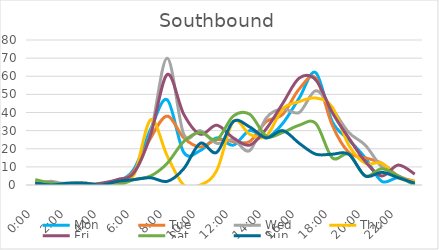
| Category | Mon | Tue | Wed | Thu | Fri | Sat | Sun |
|---|---|---|---|---|---|---|---|
| 0.0 | 0 | 1 | 1 | 2 | 1 | 3 | 1 |
| 0.041667 | 1 | 0 | 2 | 0 | 1 | 1 | 0 |
| 0.083333 | 0 | 0 | 0 | 0 | 0 | 1 | 1 |
| 0.125 | 0 | 1 | 0 | 0 | 0 | 1 | 1 |
| 0.166667 | 0 | 0 | 0 | 0 | 1 | 0 | 0 |
| 0.208333 | 2 | 1 | 3 | 2 | 3 | 0 | 2 |
| 0.25 | 9 | 8 | 7 | 6 | 7 | 3 | 3 |
| 0.291667 | 31 | 26 | 29 | 36 | 28 | 5 | 4 |
| 0.333333 | 47 | 38 | 70 | 16 | 61 | 12 | 2 |
| 0.375 | 18 | 26 | 28 | 0 | 39 | 24 | 9 |
| 0.416667 | 19 | 21 | 30 | 0 | 28 | 29 | 23 |
| 0.458333 | 26 | 25 | 23 | 8 | 33 | 25 | 18 |
| 0.5 | 22 | 24 | 25 | 35 | 26 | 38 | 35 |
| 0.541667 | 30 | 24 | 19 | 28 | 22 | 39 | 32 |
| 0.5833333333333334 | 26 | 35 | 37 | 27 | 31 | 27 | 26 |
| 0.625 | 34 | 39 | 42 | 42 | 45 | 29 | 30 |
| 0.666667 | 48 | 53 | 40 | 46 | 59 | 33 | 23 |
| 0.708333 | 62 | 59 | 52 | 48 | 58 | 34 | 17 |
| 0.75 | 35 | 33 | 42 | 43 | 40 | 15 | 17 |
| 0.791667 | 25 | 18 | 29 | 22 | 26 | 17 | 17 |
| 0.833333 | 15 | 15 | 22 | 12 | 13 | 5 | 5 |
| 0.875 | 2 | 12 | 10 | 12 | 5 | 9 | 7 |
| 0.916667 | 4 | 5 | 5 | 4 | 11 | 5 | 4 |
| 0.958333 | 0 | 2 | 1 | 2 | 6 | 0 | 1 |